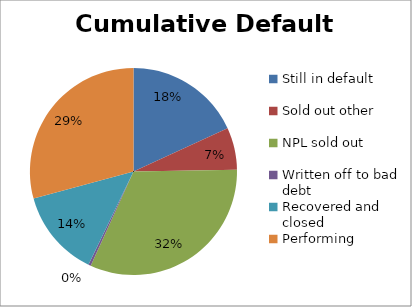
| Category | Cumulative Default Breakdown |
|---|---|
| Still in default | 0.182 |
| Sold out other | 0.066 |
| NPL sold out | 0.321 |
| Written off to bad debt | 0.004 |
| Recovered and closed | 0.136 |
| Performing | 0.292 |